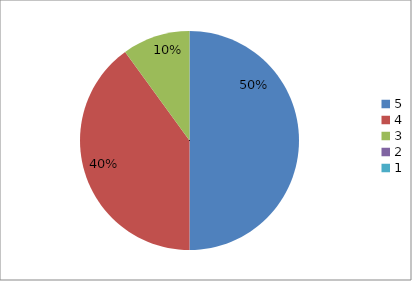
| Category | Series 0 | Series 1 |
|---|---|---|
| 5.0 | 50 | 50 |
| 4.0 | 40 | 40 |
| 3.0 | 10 | 10 |
| 2.0 | 0 | 0 |
| 1.0 | 0 | 0 |